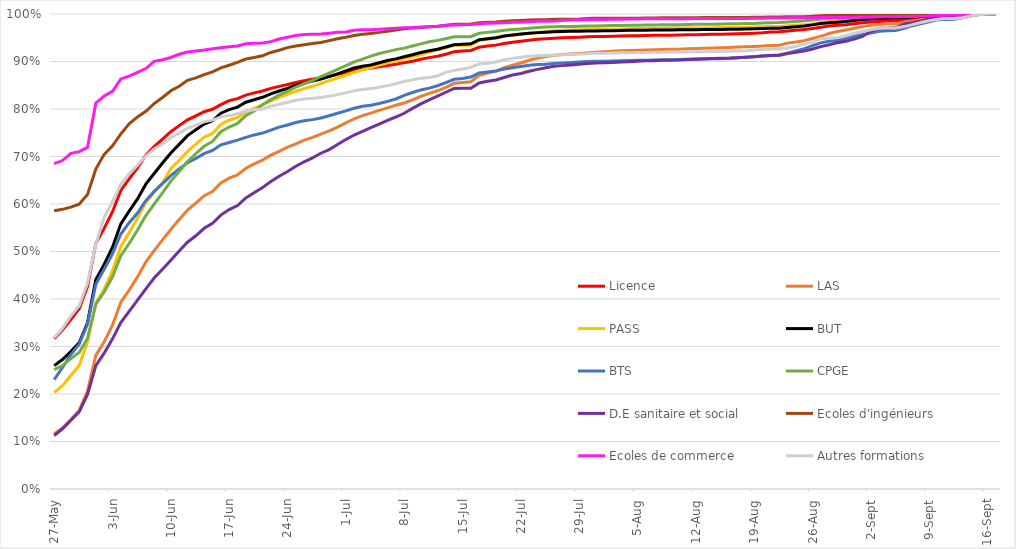
| Category | Licence | LAS | PASS | BUT | BTS | CPGE | D.E sanitaire et social | Ecoles d'ingénieurs | Ecoles de commerce | Autres formations |
|---|---|---|---|---|---|---|---|---|---|---|
| 2021-05-27 | 0.317 | 0.116 | 0.203 | 0.26 | 0.23 | 0.251 | 0.113 | 0.586 | 0.685 | 0.318 |
| 2021-05-28 | 0.335 | 0.128 | 0.218 | 0.273 | 0.256 | 0.26 | 0.127 | 0.589 | 0.691 | 0.338 |
| 2021-05-29 | 0.357 | 0.146 | 0.239 | 0.289 | 0.283 | 0.275 | 0.145 | 0.593 | 0.707 | 0.364 |
| 2021-05-30 | 0.379 | 0.165 | 0.26 | 0.308 | 0.305 | 0.287 | 0.163 | 0.6 | 0.71 | 0.386 |
| 2021-05-31 | 0.426 | 0.206 | 0.31 | 0.35 | 0.347 | 0.317 | 0.199 | 0.62 | 0.719 | 0.433 |
| 2021-06-01 | 0.517 | 0.281 | 0.391 | 0.441 | 0.431 | 0.389 | 0.26 | 0.674 | 0.813 | 0.515 |
| 2021-06-02 | 0.549 | 0.31 | 0.42 | 0.473 | 0.463 | 0.415 | 0.286 | 0.704 | 0.827 | 0.572 |
| 2021-06-03 | 0.584 | 0.345 | 0.459 | 0.509 | 0.495 | 0.447 | 0.316 | 0.723 | 0.837 | 0.605 |
| 2021-06-04 | 0.629 | 0.393 | 0.511 | 0.558 | 0.537 | 0.491 | 0.35 | 0.747 | 0.863 | 0.642 |
| 2021-06-05 | 0.653 | 0.419 | 0.54 | 0.585 | 0.561 | 0.517 | 0.374 | 0.769 | 0.869 | 0.663 |
| 2021-06-06 | 0.676 | 0.446 | 0.57 | 0.611 | 0.581 | 0.545 | 0.397 | 0.783 | 0.877 | 0.682 |
| 2021-06-07 | 0.703 | 0.478 | 0.603 | 0.642 | 0.607 | 0.576 | 0.421 | 0.795 | 0.885 | 0.701 |
| 2021-06-08 | 0.721 | 0.502 | 0.625 | 0.664 | 0.626 | 0.6 | 0.444 | 0.811 | 0.9 | 0.716 |
| 2021-06-09 | 0.737 | 0.524 | 0.644 | 0.686 | 0.643 | 0.624 | 0.463 | 0.824 | 0.904 | 0.727 |
| 2021-06-10 | 0.752 | 0.546 | 0.674 | 0.707 | 0.66 | 0.648 | 0.482 | 0.838 | 0.908 | 0.739 |
| 2021-06-11 | 0.765 | 0.567 | 0.692 | 0.726 | 0.674 | 0.668 | 0.501 | 0.848 | 0.915 | 0.749 |
| 2021-06-12 | 0.777 | 0.587 | 0.711 | 0.744 | 0.687 | 0.689 | 0.52 | 0.86 | 0.92 | 0.759 |
| 2021-06-13 | 0.786 | 0.602 | 0.726 | 0.756 | 0.696 | 0.706 | 0.533 | 0.865 | 0.922 | 0.766 |
| 2021-06-14 | 0.794 | 0.617 | 0.741 | 0.768 | 0.706 | 0.722 | 0.549 | 0.873 | 0.924 | 0.773 |
| 2021-06-15 | 0.799 | 0.626 | 0.748 | 0.775 | 0.713 | 0.732 | 0.559 | 0.878 | 0.927 | 0.777 |
| 2021-06-16 | 0.809 | 0.644 | 0.767 | 0.791 | 0.725 | 0.752 | 0.577 | 0.886 | 0.929 | 0.783 |
| 2021-06-17 | 0.818 | 0.654 | 0.777 | 0.799 | 0.729 | 0.762 | 0.588 | 0.892 | 0.931 | 0.786 |
| 2021-06-18 | 0.822 | 0.661 | 0.782 | 0.804 | 0.734 | 0.77 | 0.597 | 0.898 | 0.933 | 0.79 |
| 2021-06-19 | 0.829 | 0.675 | 0.794 | 0.814 | 0.74 | 0.786 | 0.613 | 0.905 | 0.937 | 0.796 |
| 2021-06-20 | 0.834 | 0.685 | 0.801 | 0.82 | 0.745 | 0.796 | 0.624 | 0.908 | 0.938 | 0.799 |
| 2021-06-21 | 0.838 | 0.692 | 0.809 | 0.825 | 0.749 | 0.809 | 0.634 | 0.912 | 0.939 | 0.8 |
| 2021-06-22 | 0.843 | 0.703 | 0.817 | 0.832 | 0.756 | 0.82 | 0.647 | 0.919 | 0.942 | 0.806 |
| 2021-06-23 | 0.848 | 0.711 | 0.824 | 0.838 | 0.762 | 0.829 | 0.658 | 0.924 | 0.947 | 0.81 |
| 2021-06-24 | 0.852 | 0.72 | 0.831 | 0.843 | 0.766 | 0.837 | 0.668 | 0.929 | 0.951 | 0.814 |
| 2021-06-25 | 0.856 | 0.727 | 0.837 | 0.85 | 0.772 | 0.846 | 0.68 | 0.933 | 0.955 | 0.818 |
| 2021-06-26 | 0.86 | 0.735 | 0.843 | 0.855 | 0.775 | 0.854 | 0.689 | 0.935 | 0.957 | 0.821 |
| 2021-06-27 | 0.863 | 0.74 | 0.848 | 0.859 | 0.778 | 0.86 | 0.697 | 0.938 | 0.957 | 0.823 |
| 2021-06-28 | 0.866 | 0.747 | 0.854 | 0.863 | 0.781 | 0.868 | 0.707 | 0.94 | 0.958 | 0.824 |
| 2021-06-29 | 0.869 | 0.754 | 0.86 | 0.868 | 0.786 | 0.875 | 0.715 | 0.944 | 0.959 | 0.827 |
| 2021-06-30 | 0.873 | 0.762 | 0.865 | 0.874 | 0.791 | 0.884 | 0.725 | 0.948 | 0.961 | 0.83 |
| 2021-07-01 | 0.877 | 0.771 | 0.871 | 0.88 | 0.796 | 0.891 | 0.736 | 0.951 | 0.962 | 0.834 |
| 2021-07-02 | 0.881 | 0.779 | 0.877 | 0.886 | 0.802 | 0.899 | 0.745 | 0.955 | 0.966 | 0.838 |
| 2021-07-03 | 0.884 | 0.786 | 0.882 | 0.89 | 0.806 | 0.905 | 0.753 | 0.957 | 0.967 | 0.841 |
| 2021-07-04 | 0.886 | 0.791 | 0.887 | 0.893 | 0.808 | 0.911 | 0.761 | 0.959 | 0.967 | 0.843 |
| 2021-07-05 | 0.889 | 0.797 | 0.893 | 0.897 | 0.812 | 0.917 | 0.768 | 0.961 | 0.968 | 0.846 |
| 2021-07-06 | 0.892 | 0.802 | 0.897 | 0.902 | 0.816 | 0.921 | 0.776 | 0.964 | 0.969 | 0.849 |
| 2021-07-07 | 0.894 | 0.808 | 0.901 | 0.905 | 0.821 | 0.925 | 0.783 | 0.966 | 0.97 | 0.853 |
| 2021-07-08 | 0.898 | 0.813 | 0.906 | 0.91 | 0.829 | 0.928 | 0.791 | 0.969 | 0.971 | 0.858 |
| 2021-07-09 | 0.9 | 0.819 | 0.91 | 0.914 | 0.835 | 0.933 | 0.801 | 0.97 | 0.972 | 0.861 |
| 2021-07-10 | 0.905 | 0.827 | 0.915 | 0.919 | 0.84 | 0.937 | 0.811 | 0.972 | 0.973 | 0.865 |
| 2021-07-11 | 0.908 | 0.833 | 0.92 | 0.922 | 0.844 | 0.941 | 0.819 | 0.973 | 0.973 | 0.866 |
| 2021-07-12 | 0.911 | 0.838 | 0.925 | 0.926 | 0.849 | 0.945 | 0.827 | 0.974 | 0.974 | 0.87 |
| 2021-07-13 | 0.915 | 0.845 | 0.929 | 0.931 | 0.856 | 0.948 | 0.835 | 0.977 | 0.976 | 0.877 |
| 2021-07-14 | 0.921 | 0.854 | 0.934 | 0.935 | 0.862 | 0.952 | 0.843 | 0.978 | 0.977 | 0.881 |
| 2021-07-15 | 0.922 | 0.856 | 0.934 | 0.936 | 0.864 | 0.952 | 0.844 | 0.978 | 0.977 | 0.884 |
| 2021-07-16 | 0.923 | 0.857 | 0.934 | 0.937 | 0.867 | 0.952 | 0.844 | 0.979 | 0.978 | 0.888 |
| 2021-07-17 | 0.93 | 0.871 | 0.944 | 0.946 | 0.876 | 0.959 | 0.855 | 0.982 | 0.98 | 0.895 |
| 2021-07-18 | 0.933 | 0.876 | 0.947 | 0.948 | 0.878 | 0.961 | 0.858 | 0.983 | 0.981 | 0.896 |
| 2021-07-19 | 0.934 | 0.879 | 0.949 | 0.95 | 0.88 | 0.963 | 0.861 | 0.983 | 0.981 | 0.899 |
| 2021-07-20 | 0.938 | 0.887 | 0.953 | 0.954 | 0.884 | 0.966 | 0.866 | 0.985 | 0.982 | 0.904 |
| 2021-07-21 | 0.94 | 0.892 | 0.955 | 0.956 | 0.887 | 0.967 | 0.871 | 0.986 | 0.982 | 0.907 |
| 2021-07-22 | 0.942 | 0.897 | 0.957 | 0.958 | 0.889 | 0.968 | 0.875 | 0.986 | 0.983 | 0.909 |
| 2021-07-23 | 0.945 | 0.902 | 0.959 | 0.959 | 0.892 | 0.97 | 0.879 | 0.987 | 0.984 | 0.911 |
| 2021-07-24 | 0.947 | 0.907 | 0.961 | 0.961 | 0.894 | 0.971 | 0.883 | 0.988 | 0.985 | 0.912 |
| 2021-07-25 | 0.948 | 0.911 | 0.963 | 0.962 | 0.894 | 0.972 | 0.887 | 0.988 | 0.985 | 0.913 |
| 2021-07-26 | 0.949 | 0.913 | 0.965 | 0.963 | 0.896 | 0.973 | 0.89 | 0.989 | 0.985 | 0.914 |
| 2021-07-27 | 0.95 | 0.915 | 0.966 | 0.963 | 0.897 | 0.974 | 0.891 | 0.989 | 0.986 | 0.914 |
| 2021-07-28 | 0.95 | 0.916 | 0.966 | 0.964 | 0.898 | 0.974 | 0.893 | 0.989 | 0.987 | 0.915 |
| 2021-07-29 | 0.951 | 0.917 | 0.967 | 0.964 | 0.899 | 0.974 | 0.894 | 0.989 | 0.988 | 0.916 |
| 2021-07-30 | 0.952 | 0.918 | 0.967 | 0.964 | 0.9 | 0.975 | 0.896 | 0.991 | 0.988 | 0.916 |
| 2021-07-31 | 0.952 | 0.92 | 0.968 | 0.964 | 0.9 | 0.975 | 0.897 | 0.991 | 0.989 | 0.917 |
| 2021-08-01 | 0.953 | 0.92 | 0.968 | 0.965 | 0.901 | 0.975 | 0.897 | 0.991 | 0.989 | 0.918 |
| 2021-08-02 | 0.953 | 0.921 | 0.968 | 0.965 | 0.901 | 0.976 | 0.898 | 0.991 | 0.989 | 0.918 |
| 2021-08-03 | 0.954 | 0.923 | 0.969 | 0.965 | 0.901 | 0.976 | 0.899 | 0.991 | 0.989 | 0.918 |
| 2021-08-04 | 0.954 | 0.923 | 0.969 | 0.966 | 0.902 | 0.976 | 0.9 | 0.991 | 0.989 | 0.919 |
| 2021-08-05 | 0.954 | 0.924 | 0.969 | 0.966 | 0.902 | 0.976 | 0.901 | 0.991 | 0.99 | 0.919 |
| 2021-08-06 | 0.955 | 0.924 | 0.969 | 0.966 | 0.903 | 0.977 | 0.901 | 0.991 | 0.99 | 0.919 |
| 2021-08-07 | 0.955 | 0.925 | 0.97 | 0.966 | 0.903 | 0.977 | 0.902 | 0.992 | 0.99 | 0.92 |
| 2021-08-08 | 0.955 | 0.925 | 0.97 | 0.966 | 0.904 | 0.977 | 0.902 | 0.992 | 0.99 | 0.92 |
| 2021-08-09 | 0.955 | 0.926 | 0.97 | 0.966 | 0.904 | 0.977 | 0.903 | 0.992 | 0.99 | 0.92 |
| 2021-08-10 | 0.956 | 0.926 | 0.97 | 0.967 | 0.904 | 0.978 | 0.903 | 0.992 | 0.99 | 0.92 |
| 2021-08-11 | 0.956 | 0.927 | 0.971 | 0.967 | 0.905 | 0.978 | 0.904 | 0.992 | 0.99 | 0.92 |
| 2021-08-12 | 0.956 | 0.927 | 0.971 | 0.967 | 0.905 | 0.978 | 0.905 | 0.992 | 0.99 | 0.921 |
| 2021-08-13 | 0.957 | 0.928 | 0.971 | 0.967 | 0.906 | 0.978 | 0.905 | 0.992 | 0.99 | 0.921 |
| 2021-08-14 | 0.957 | 0.928 | 0.971 | 0.967 | 0.906 | 0.979 | 0.906 | 0.993 | 0.99 | 0.921 |
| 2021-08-15 | 0.957 | 0.929 | 0.972 | 0.967 | 0.906 | 0.979 | 0.907 | 0.993 | 0.99 | 0.921 |
| 2021-08-16 | 0.958 | 0.93 | 0.972 | 0.968 | 0.906 | 0.979 | 0.907 | 0.993 | 0.99 | 0.922 |
| 2021-08-17 | 0.958 | 0.93 | 0.972 | 0.968 | 0.908 | 0.98 | 0.908 | 0.993 | 0.991 | 0.922 |
| 2021-08-18 | 0.959 | 0.931 | 0.972 | 0.968 | 0.909 | 0.98 | 0.909 | 0.993 | 0.991 | 0.923 |
| 2021-08-19 | 0.96 | 0.932 | 0.973 | 0.969 | 0.91 | 0.98 | 0.91 | 0.993 | 0.991 | 0.924 |
| 2021-08-20 | 0.96 | 0.932 | 0.973 | 0.97 | 0.911 | 0.981 | 0.912 | 0.993 | 0.991 | 0.925 |
| 2021-08-21 | 0.962 | 0.934 | 0.974 | 0.97 | 0.912 | 0.981 | 0.913 | 0.994 | 0.991 | 0.926 |
| 2021-08-22 | 0.963 | 0.934 | 0.974 | 0.97 | 0.913 | 0.982 | 0.914 | 0.994 | 0.991 | 0.927 |
| 2021-08-23 | 0.964 | 0.939 | 0.975 | 0.972 | 0.917 | 0.983 | 0.917 | 0.994 | 0.992 | 0.929 |
| 2021-08-24 | 0.966 | 0.941 | 0.976 | 0.973 | 0.922 | 0.984 | 0.919 | 0.994 | 0.992 | 0.932 |
| 2021-08-25 | 0.967 | 0.944 | 0.978 | 0.975 | 0.927 | 0.986 | 0.922 | 0.994 | 0.992 | 0.937 |
| 2021-08-26 | 0.97 | 0.948 | 0.979 | 0.977 | 0.933 | 0.988 | 0.926 | 0.995 | 0.992 | 0.941 |
| 2021-08-27 | 0.972 | 0.953 | 0.982 | 0.98 | 0.939 | 0.989 | 0.931 | 0.996 | 0.993 | 0.948 |
| 2021-08-28 | 0.975 | 0.959 | 0.985 | 0.982 | 0.943 | 0.991 | 0.935 | 0.997 | 0.993 | 0.949 |
| 2021-08-29 | 0.976 | 0.963 | 0.987 | 0.983 | 0.945 | 0.993 | 0.94 | 0.997 | 0.993 | 0.95 |
| 2021-08-30 | 0.977 | 0.966 | 0.989 | 0.984 | 0.949 | 0.994 | 0.942 | 0.998 | 0.993 | 0.954 |
| 2021-08-31 | 0.98 | 0.97 | 0.991 | 0.986 | 0.953 | 0.996 | 0.947 | 0.998 | 0.993 | 0.959 |
| 2021-09-01 | 0.981 | 0.973 | 0.993 | 0.988 | 0.957 | 0.997 | 0.953 | 0.999 | 0.993 | 0.963 |
| 2021-09-02 | 0.983 | 0.976 | 0.994 | 0.99 | 0.96 | 0.997 | 0.963 | 0.999 | 0.993 | 0.967 |
| 2021-09-03 | 0.984 | 0.978 | 0.995 | 0.991 | 0.964 | 0.998 | 0.97 | 0.999 | 0.994 | 0.97 |
| 2021-09-04 | 0.985 | 0.979 | 0.995 | 0.991 | 0.965 | 0.998 | 0.97 | 0.999 | 0.994 | 0.971 |
| 2021-09-05 | 0.986 | 0.98 | 0.995 | 0.991 | 0.965 | 0.998 | 0.971 | 0.999 | 0.994 | 0.971 |
| 2021-09-06 | 0.987 | 0.983 | 0.996 | 0.993 | 0.97 | 0.998 | 0.979 | 0.999 | 0.995 | 0.973 |
| 2021-09-07 | 0.988 | 0.985 | 0.996 | 0.994 | 0.975 | 0.998 | 0.982 | 0.999 | 0.995 | 0.978 |
| 2021-09-08 | 0.99 | 0.988 | 0.997 | 0.995 | 0.979 | 0.999 | 0.985 | 0.999 | 0.995 | 0.982 |
| 2021-09-09 | 0.992 | 0.99 | 0.998 | 0.996 | 0.984 | 0.999 | 0.99 | 1 | 0.996 | 0.986 |
| 2021-09-10 | 0.993 | 0.992 | 0.998 | 0.997 | 0.988 | 0.999 | 0.993 | 1 | 0.997 | 0.989 |
| 2021-09-11 | 0.994 | 0.994 | 0.998 | 0.997 | 0.988 | 0.999 | 0.993 | 1 | 0.997 | 0.99 |
| 2021-09-12 | 0.995 | 0.994 | 0.998 | 0.997 | 0.989 | 0.999 | 0.993 | 1 | 0.998 | 0.99 |
| 2021-09-13 | 0.996 | 0.996 | 0.999 | 0.998 | 0.992 | 1 | 0.996 | 1 | 0.998 | 0.992 |
| 2021-09-14 | 0.997 | 0.998 | 0.999 | 0.999 | 0.996 | 1 | 0.997 | 1 | 0.998 | 0.996 |
| 2021-09-15 | 0.999 | 1 | 1 | 1 | 0.999 | 1 | 0.999 | 1 | 0.999 | 0.998 |
| 2021-09-16 | 1 | 1 | 1 | 1 | 1 | 1 | 1 | 1 | 1 | 1 |
| 2021-09-17 | 1 | 1 | 1 | 1 | 1 | 1 | 1 | 1 | 1 | 1 |